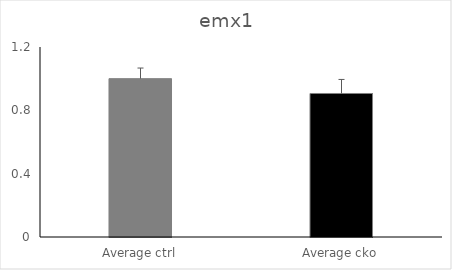
| Category |  emx1 |
|---|---|
| Average ctrl | 1 |
| Average cko | 0.906 |